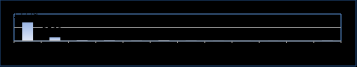
| Category | Series 0 |
|---|---|
| Jan 15 | 13779 |
| Feb 15 | 2760 |
| Mar 15 | 510 |
| Apr 15 | 422 |
| May 15 | 120 |
| Jun 15 | 345 |
| Jul 15 | 142 |
| Aug 15 | 64 |
| Sep 15 | 39 |
| Oct 15 | 36 |
| Nov 15 | 14 |
| Dec 15 | 198 |